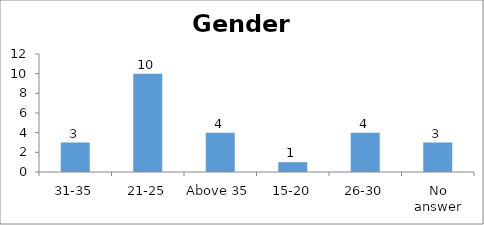
| Category | Gender |
|---|---|
| 31-35 | 3 |
| 21-25 | 10 |
| Above 35 | 4 |
| 15-20 | 1 |
| 26-30 | 4 |
| No answer | 3 |